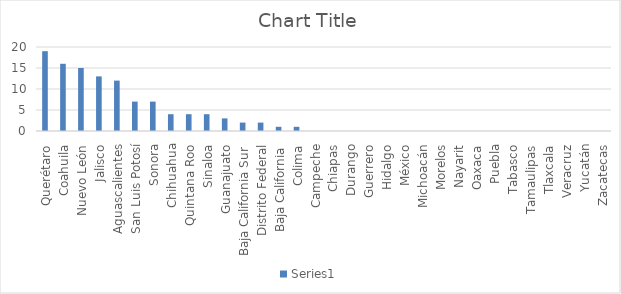
| Category | Series 0 |
|---|---|
| Querétaro | 19 |
| Coahuila | 16 |
| Nuevo León | 15 |
| Jalisco | 13 |
| Aguascalientes | 12 |
| San Luis Potosí | 7 |
| Sonora | 7 |
| Chihuahua | 4 |
| Quintana Roo | 4 |
| Sinaloa | 4 |
| Guanajuato | 3 |
| Baja California Sur | 2 |
| Distrito Federal | 2 |
| Baja California | 1 |
| Colima | 1 |
| Campeche | 0 |
| Chiapas | 0 |
| Durango | 0 |
| Guerrero | 0 |
| Hidalgo | 0 |
| México | 0 |
| Michoacán | 0 |
| Morelos | 0 |
| Nayarit | 0 |
| Oaxaca | 0 |
| Puebla | 0 |
| Tabasco | 0 |
| Tamaulipas | 0 |
| Tlaxcala | 0 |
| Veracruz | 0 |
| Yucatán | 0 |
| Zacatecas | 0 |